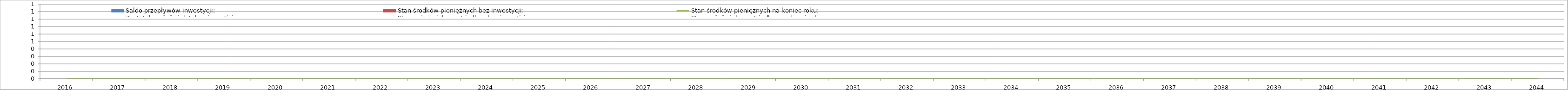
| Category | Stan środków pieniężnych bez inwestycji:
Stav peňažných prostriedkov bez investície: | Saldo przepływów inwestycji:
Zostatok peňažných tokov investície: |
|---|---|---|
| 2016.0 | 0 | 0 |
| 2017.0 | 0 | 0 |
| 2018.0 | 0 | 0 |
| 2019.0 | 0 | 0 |
| 2020.0 | 0 | 0 |
| 2021.0 | 0 | 0 |
| 2022.0 | 0 | 0 |
| 2023.0 | 0 | 0 |
| 2024.0 | 0 | 0 |
| 2025.0 | 0 | 0 |
| 2026.0 | 0 | 0 |
| 2027.0 | 0 | 0 |
| 2028.0 | 0 | 0 |
| 2029.0 | 0 | 0 |
| 2030.0 | 0 | 0 |
| 2031.0 | 0 | 0 |
| 2032.0 | 0 | 0 |
| 2033.0 | 0 | 0 |
| 2034.0 | 0 | 0 |
| 2035.0 | 0 | 0 |
| 2036.0 | 0 | 0 |
| 2037.0 | 0 | 0 |
| 2038.0 | 0 | 0 |
| 2039.0 | 0 | 0 |
| 2040.0 | 0 | 0 |
| 2041.0 | 0 | 0 |
| 2042.0 | 0 | 0 |
| 2043.0 | 0 | 0 |
| 2044.0 | 0 | 0 |